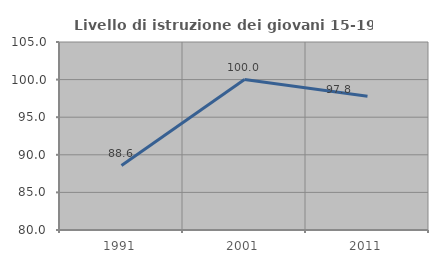
| Category | Livello di istruzione dei giovani 15-19 anni |
|---|---|
| 1991.0 | 88.571 |
| 2001.0 | 100 |
| 2011.0 | 97.778 |